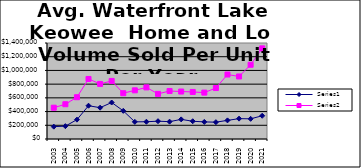
| Category | Series 0 | Series 1 |
|---|---|---|
| 2003.0 | 180188 | 456225 |
| 2004.0 | 187619 | 507014 |
| 2005.0 | 282153 | 609199 |
| 2006.0 | 485305 | 875482 |
| 2007.0 | 456742 | 803432 |
| 2008.0 | 532091 | 846541 |
| 2009.0 | 410777 | 667624 |
| 2010.0 | 249982 | 709658 |
| 2011.0 | 251757 | 752512 |
| 2012.0 | 259674 | 657878 |
| 2013.0 | 252883 | 700164 |
| 2014.0 | 286107 | 692125 |
| 2015.0 | 258976 | 686138 |
| 2016.0 | 249095 | 676553 |
| 2017.0 | 245481 | 743287 |
| 2018.0 | 271575 | 940258 |
| 2019.0 | 296997 | 911787 |
| 2020.0 | 294011 | 1082773 |
| 2021.0 | 338985 | 1321614 |